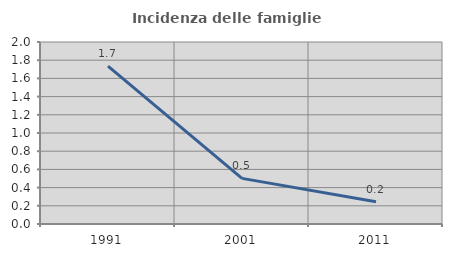
| Category | Incidenza delle famiglie numerose |
|---|---|
| 1991.0 | 1.734 |
| 2001.0 | 0.501 |
| 2011.0 | 0.244 |